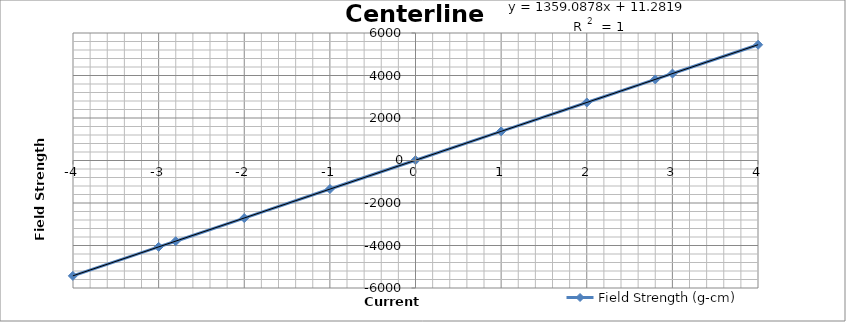
| Category | Field Strength (g-cm) |
|---|---|
| 4.001642608695653 | 5446.691 |
| 3.0013501242236016 | 4092.471 |
| 2.799990807453417 | 3814.909 |
| 2.0004389440993786 | 2729.687 |
| 1.0002734161490685 | 1371.812 |
| -0.00021322981366459637 | 13.641 |
| -0.9992688819875771 | -1341.812 |
| -2.000136459627329 | -2708.805 |
| -2.8007646583850914 | -3798.158 |
| -2.9997113043478265 | -4064.312 |
| -4.001698198757763 | -5429.438 |